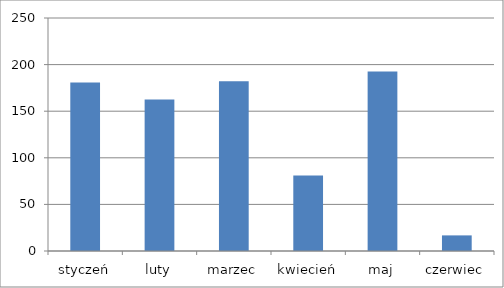
| Category | produkt 1 |
|---|---|
| styczeń | 180.825 |
| luty | 162.499 |
| marzec | 182.14 |
| kwiecień | 81.042 |
| maj | 192.721 |
| czerwiec | 16.75 |